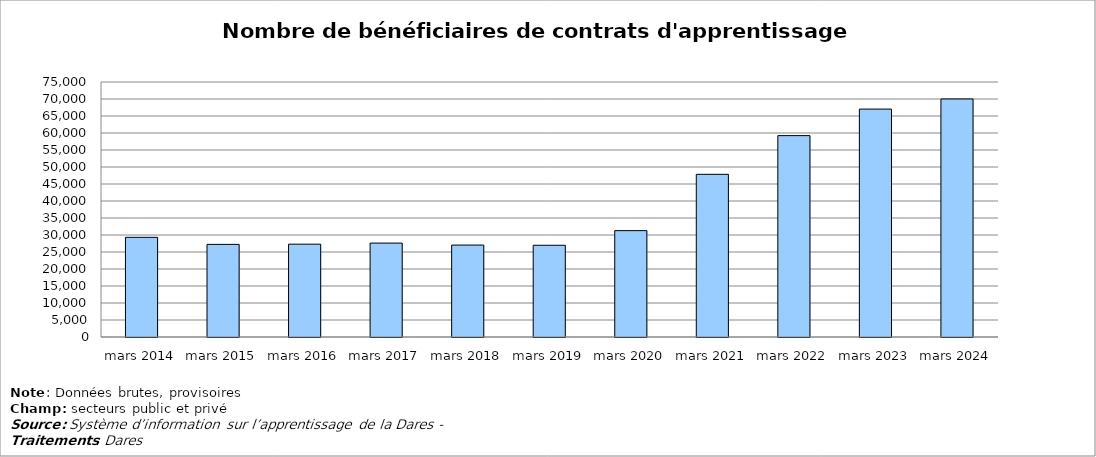
| Category | Series 0 |
|---|---|
| mars 2014 | 29318 |
| mars 2015 | 27240 |
| mars 2016 | 27305 |
| mars 2017 | 27621 |
| mars 2018 | 27037 |
| mars 2019 | 26977 |
| mars 2020 | 31286 |
| mars 2021 | 47845 |
| mars 2022 | 59229 |
| mars 2023 | 67035 |
| mars 2024 | 70013 |